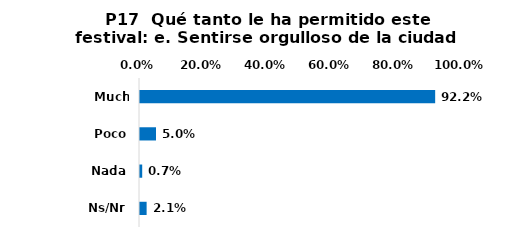
| Category | Series 0 |
|---|---|
| Mucho | 0.922 |
| Poco | 0.05 |
| Nada | 0.007 |
| Ns/Nr | 0.021 |